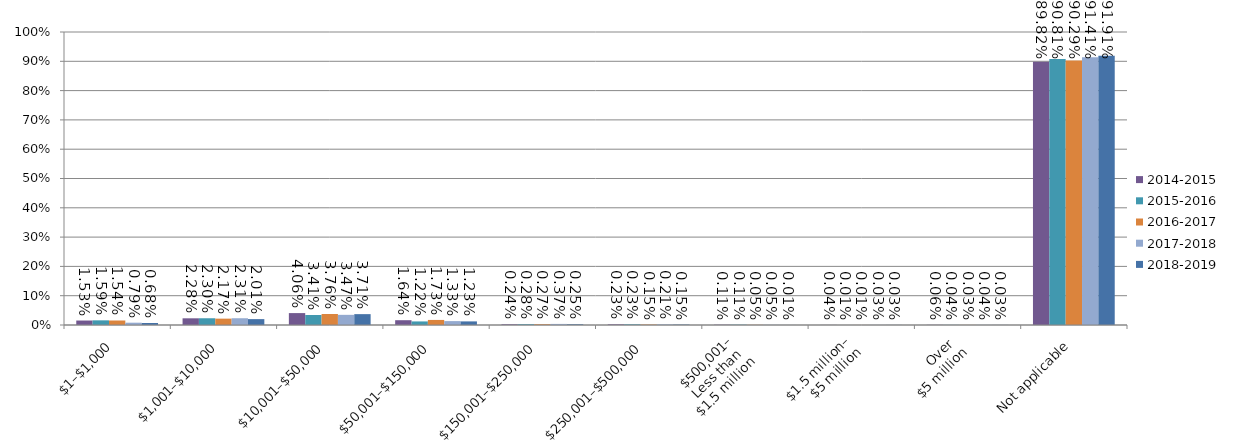
| Category | 2014-2015 | 2015-2016 | 2016-2017 | 2017-2018 | 2018-2019 |
|---|---|---|---|---|---|
| $1–$1,000 | 0.015 | 0.016 | 0.015 | 0.008 | 0.007 |
| $1,001–$10,000 | 0.023 | 0.023 | 0.022 | 0.023 | 0.02 |
| $10,001–$50,000 | 0.041 | 0.034 | 0.038 | 0.035 | 0.037 |
| $50,001–$150,000 | 0.016 | 0.012 | 0.017 | 0.013 | 0.012 |
| $150,001–$250,000 | 0.002 | 0.003 | 0.003 | 0.004 | 0.003 |
| $250,001–$500,000 | 0.002 | 0.002 | 0.002 | 0.002 | 0.001 |
| $500,001–
Less than 
$1.5 million | 0.001 | 0.001 | 0.001 | 0.001 | 0 |
| $1.5 million–
$5 million | 0 | 0 | 0 | 0 | 0 |
| Over 
$5 million | 0.001 | 0 | 0 | 0 | 0 |
| Not applicable | 0.898 | 0.908 | 0.903 | 0.914 | 0.919 |